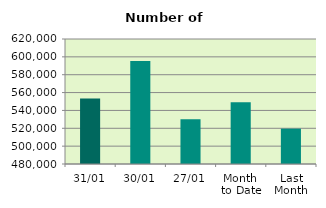
| Category | Series 0 |
|---|---|
| 31/01 | 553230 |
| 30/01 | 595340 |
| 27/01 | 530056 |
| Month 
to Date | 549126.273 |
| Last
Month | 519611.714 |